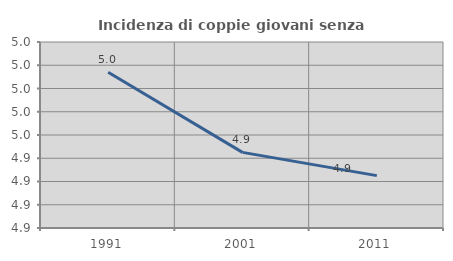
| Category | Incidenza di coppie giovani senza figli |
|---|---|
| 1991.0 | 5.014 |
| 2001.0 | 4.945 |
| 2011.0 | 4.925 |